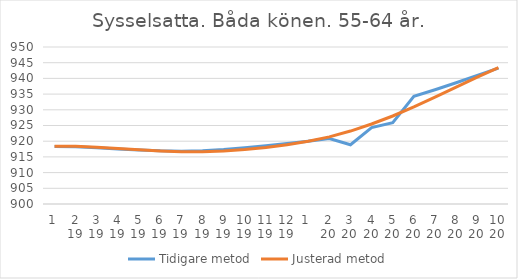
| Category | Tidigare metod | Justerad metod |
|---|---|---|
| 0 | 918.28 | 918.41 |
| 1 | 918.25 | 918.41 |
| 2 | 917.93 | 918.09 |
| 3 | 917.53 | 917.65 |
| 4 | 917.18 | 917.24 |
| 5 | 916.93 | 916.9 |
| 6 | 916.83 | 916.67 |
| 7 | 916.97 | 916.65 |
| 8 | 917.37 | 916.9 |
| 9 | 917.94 | 917.36 |
| 10 | 918.56 | 917.99 |
| 11 | 919.24 | 918.84 |
| 12 | 920 | 919.96 |
| 13 | 920.84 | 921.38 |
| 14 | 918.86 | 923.23 |
| 15 | 924.36 | 925.47 |
| 16 | 925.89 | 928.03 |
| 17 | 934.3 | 930.91 |
| 18 | 936.38 | 934.04 |
| 19 | 938.62 | 937.25 |
| 20 | 940.95 | 940.42 |
| 21 | 943.27 | 943.4 |